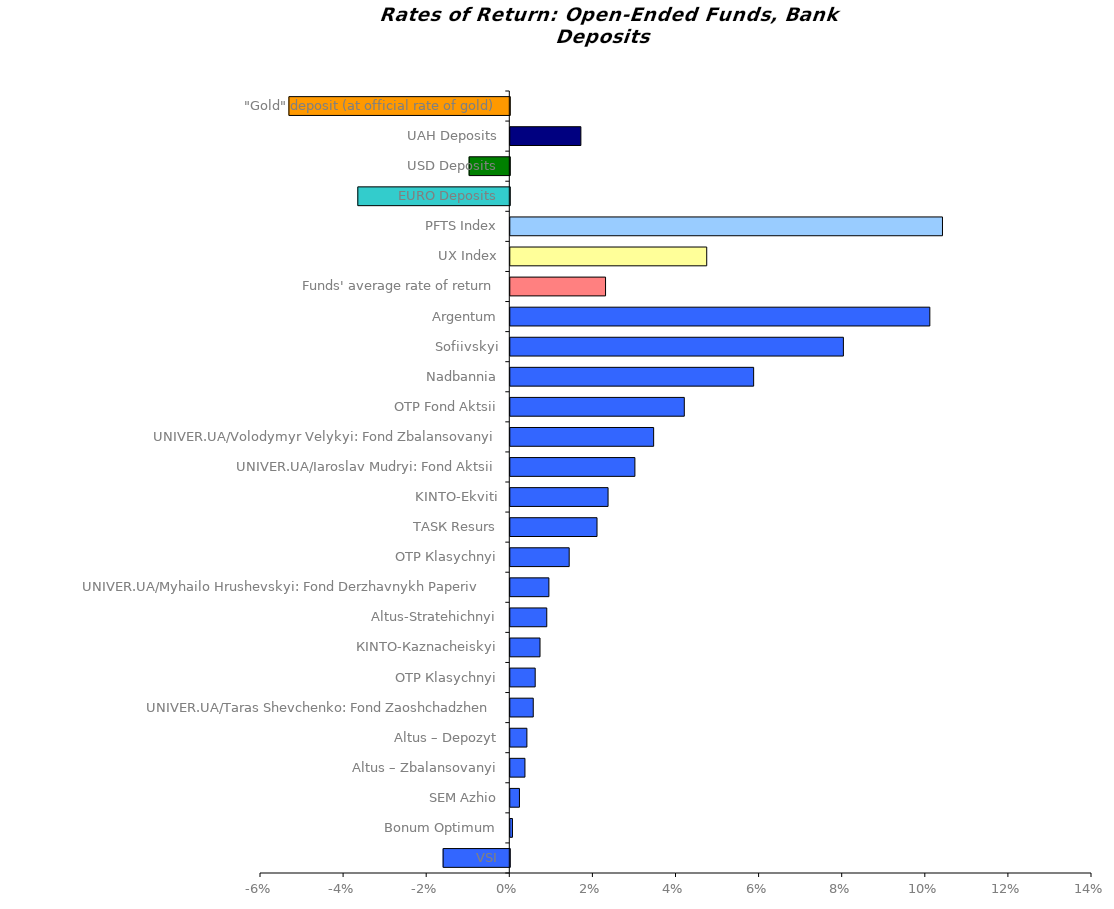
| Category | Series 0 |
|---|---|
| VSI | -0.016 |
| Bonum Optimum | 0.001 |
| SEM Azhio | 0.002 |
| Altus – Zbalansovanyi | 0.004 |
| Altus – Depozyt | 0.004 |
| UNIVER.UA/Taras Shevchenko: Fond Zaoshchadzhen | 0.006 |
| ОТP Кlasychnyi | 0.006 |
| КІNTO-Каznacheiskyi | 0.007 |
| Altus-Stratehichnyi | 0.009 |
| UNIVER.UA/Myhailo Hrushevskyi: Fond Derzhavnykh Paperiv    | 0.009 |
| ОТP Кlasychnyi | 0.014 |
| ТАSК Resurs | 0.021 |
| KINTO-Ekviti | 0.024 |
| UNIVER.UA/Iaroslav Mudryi: Fond Aktsii | 0.03 |
| UNIVER.UA/Volodymyr Velykyi: Fond Zbalansovanyi | 0.035 |
| ОТP Fond Aktsii | 0.042 |
| Nadbannia | 0.059 |
| Sofiivskyi | 0.08 |
| Аrgentum | 0.101 |
| Funds' average rate of return | 0.023 |
| UX Index | 0.047 |
| PFTS Index | 0.104 |
| EURO Deposits | -0.037 |
| USD Deposits | -0.01 |
| UAH Deposits | 0.017 |
| "Gold" deposit (at official rate of gold) | -0.053 |